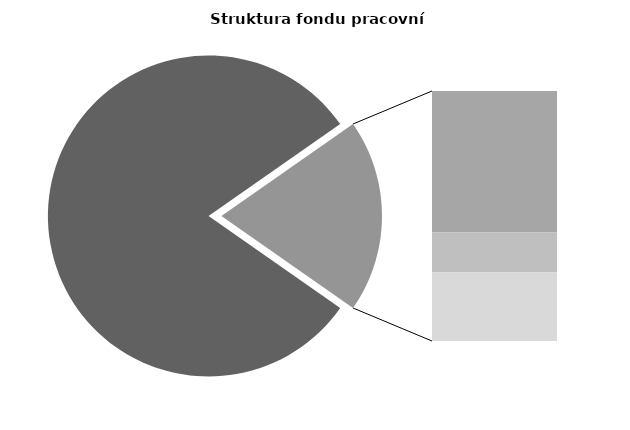
| Category | Series 0 |
|---|---|
| Průměrná měsíční odpracovaná doba bez přesčasu | 138.673 |
| Dovolená | 18.907 |
| Nemoc | 5.342 |
| Jiné | 9.176 |